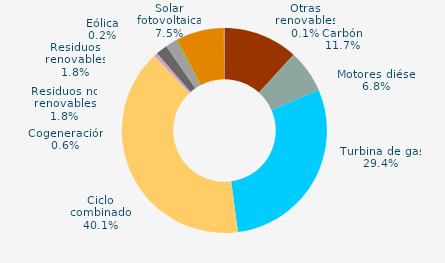
| Category | Series 0 |
|---|---|
| Carbón | 11.749 |
| Motores diésel | 6.79 |
| Turbina de gas | 29.376 |
| Ciclo combinado | 40.083 |
| Generación auxiliar | 0 |
| Cogeneración | 0.561 |
| Residuos no renovables | 1.822 |
| Residuos renovables | 1.822 |
| Eólica | 0.176 |
| Solar fotovoltaica | 7.518 |
| Otras renovables | 0.104 |